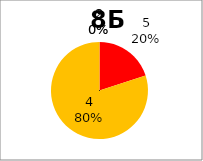
| Category | Series 0 |
|---|---|
| 5.0 | 2 |
| 4.0 | 8 |
| 3.0 | 0 |
| 2.0 | 0 |